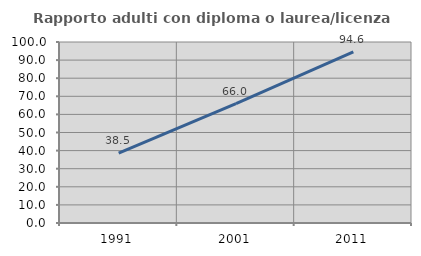
| Category | Rapporto adulti con diploma o laurea/licenza media  |
|---|---|
| 1991.0 | 38.542 |
| 2001.0 | 66.002 |
| 2011.0 | 94.599 |